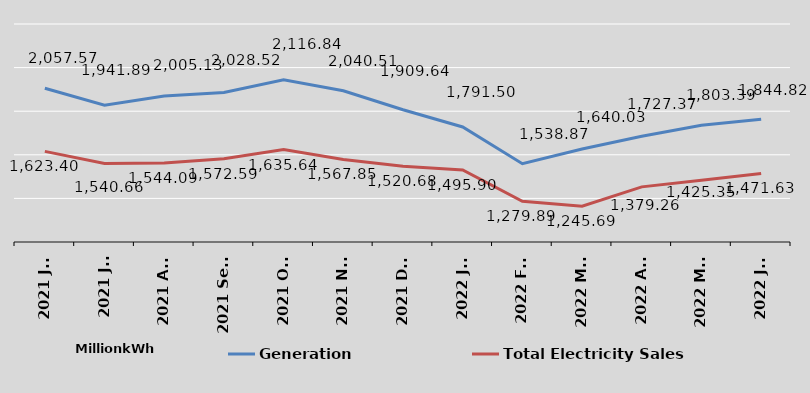
| Category | Generation
 | Total Electricity Sales |
|---|---|---|
| 2021 Jun | 2057.57 | 1623.4 |
| 2021 Jul | 1941.89 | 1540.66 |
| 2021 Aug | 2005.13 | 1544.09 |
| 2021 Sept | 2028.52 | 1572.59 |
| 2021 Oct | 2116.835 | 1635.64 |
| 2021 Nov | 2040.513 | 1567.85 |
| 2021 Dec | 1909.64 | 1520.68 |
| 2022 Jan | 1791.497 | 1495.9 |
| 2022 Feb | 1538.87 | 1279.89 |
| 2022 Mar | 1640.03 | 1245.69 |
| 2022 Apr | 1727.37 | 1379.26 |
| 2022 May | 1803.39 | 1425.35 |
| 2022 Jun | 1844.82 | 1471.63 |